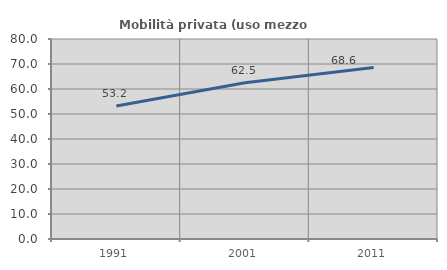
| Category | Mobilità privata (uso mezzo privato) |
|---|---|
| 1991.0 | 53.166 |
| 2001.0 | 62.538 |
| 2011.0 | 68.594 |